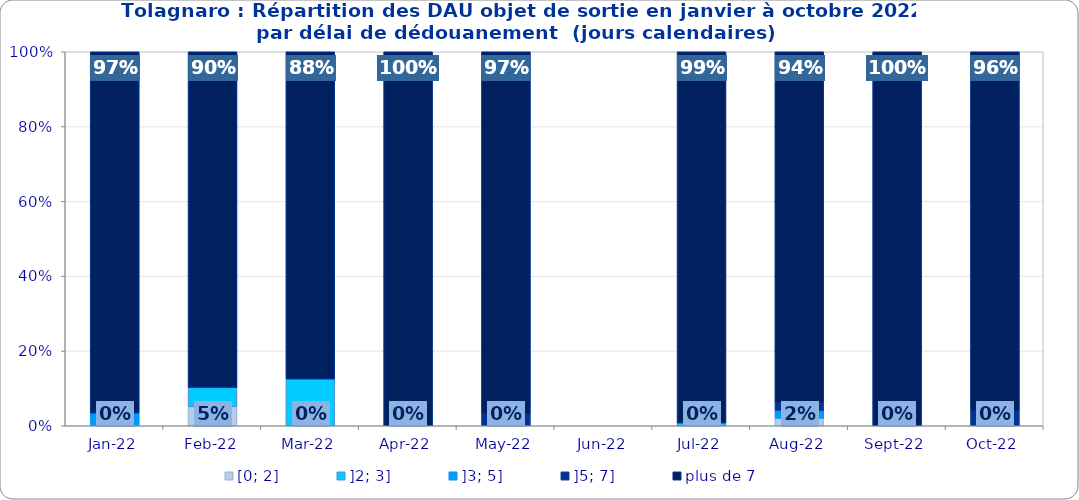
| Category | [0; 2] | ]2; 3] | ]3; 5] | ]5; 7] | plus de 7 |
|---|---|---|---|---|---|
| 2022-01-01 | 0 | 0 | 0.034 | 0 | 0.966 |
| 2022-02-01 | 0.051 | 0.051 | 0 | 0 | 0.897 |
| 2022-03-01 | 0 | 0.125 | 0 | 0 | 0.875 |
| 2022-04-01 | 0 | 0 | 0 | 0 | 1 |
| 2022-05-01 | 0 | 0 | 0 | 0.031 | 0.969 |
| 2022-06-01 | 0 | 0 | 0 | 0 | 0 |
| 2022-07-01 | 0 | 0.007 | 0 | 0 | 0.993 |
| 2022-08-01 | 0.02 | 0 | 0.02 | 0.02 | 0.94 |
| 2022-09-01 | 0 | 0 | 0 | 0 | 1 |
| 2022-10-01 | 0 | 0 | 0 | 0.039 | 0.961 |